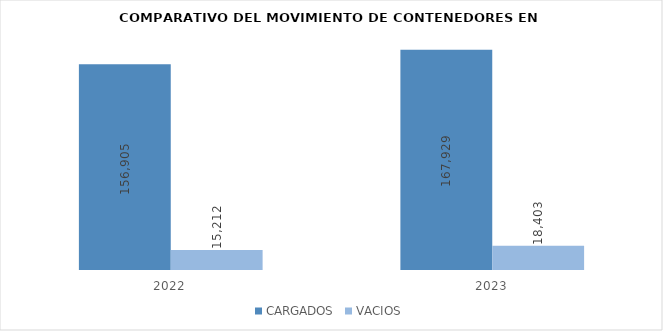
| Category | CARGADOS | VACIOS |
|---|---|---|
| 2022.0 | 156905 | 15212 |
| 2023.0 | 167928.5 | 18403 |